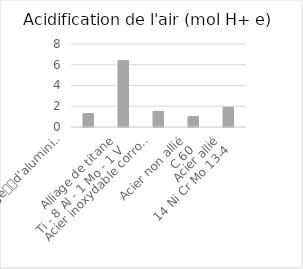
| Category | Series 0 |
|---|---|
| Alliage
d'aluminium
4032-T6
(Al Si 12,5 Mg Cu Ni) | 1.3 |
| Alliage de titane
Ti - 8 Al - 1 Mo - 1 V | 6.4 |
| Acier inoxydable corroyé
X6 Cr Ni Ti 18-10 | 1.5 |
| Acier non allié
C 60 | 1 |
| Acier allié
14 Ni Cr Mo 13-4 | 1.9 |